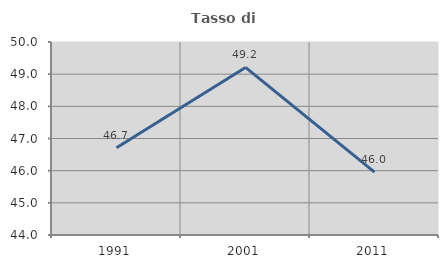
| Category | Tasso di occupazione   |
|---|---|
| 1991.0 | 46.715 |
| 2001.0 | 49.21 |
| 2011.0 | 45.953 |